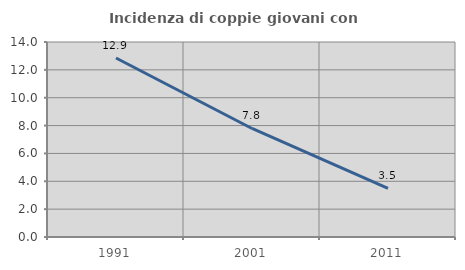
| Category | Incidenza di coppie giovani con figli |
|---|---|
| 1991.0 | 12.851 |
| 2001.0 | 7.792 |
| 2011.0 | 3.491 |